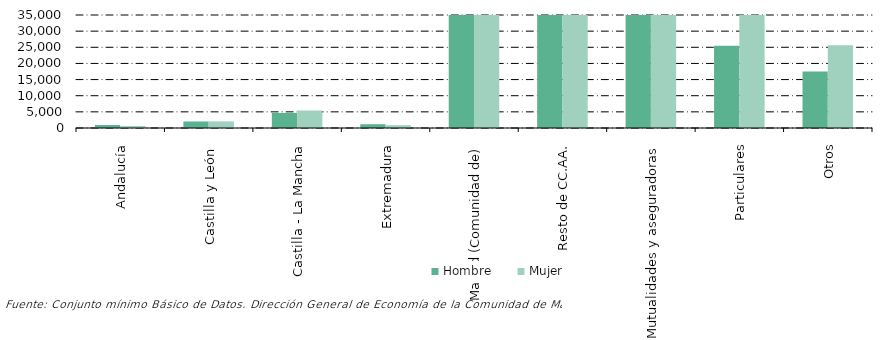
| Category | Hombre | Mujer |
|---|---|---|
| Andalucía | 928 | 631 |
| Castilla y León  | 2022 | 2042 |
| Castilla - La Mancha | 4667 | 5435 |
| Extremadura | 1159 | 878 |
| Madrid (Comunidad de) | 562914 | 680641 |
| Resto de CC.AA. | 269404 | 316051 |
| Mutualidades y aseguradoras | 209146 | 239484 |
| Particulares | 25450 | 41713 |
| Otros | 17463 | 25618 |